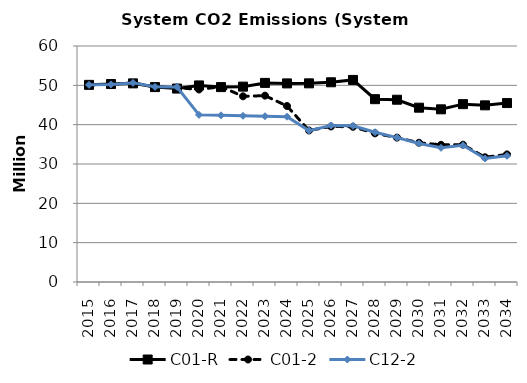
| Category | C01-R | C01-2 | C12-2 |
|---|---|---|---|
| 2015.0 | 50.118 | 50.118 | 50.118 |
| 2016.0 | 50.329 | 50.238 | 50.238 |
| 2017.0 | 50.499 | 50.622 | 50.622 |
| 2018.0 | 49.555 | 49.636 | 49.62 |
| 2019.0 | 49.181 | 49.421 | 49.588 |
| 2020.0 | 49.976 | 48.938 | 42.494 |
| 2021.0 | 49.548 | 49.665 | 42.376 |
| 2022.0 | 49.671 | 47.203 | 42.259 |
| 2023.0 | 50.618 | 47.383 | 42.141 |
| 2024.0 | 50.491 | 44.746 | 42.024 |
| 2025.0 | 50.508 | 38.519 | 38.489 |
| 2026.0 | 50.777 | 39.539 | 39.786 |
| 2027.0 | 51.38 | 39.462 | 39.697 |
| 2028.0 | 46.481 | 37.785 | 38.08 |
| 2029.0 | 46.342 | 36.715 | 36.702 |
| 2030.0 | 44.317 | 35.397 | 35.233 |
| 2031.0 | 43.901 | 34.881 | 34.119 |
| 2032.0 | 45.215 | 34.915 | 34.754 |
| 2033.0 | 44.915 | 31.713 | 31.394 |
| 2034.0 | 45.496 | 32.435 | 32.084 |